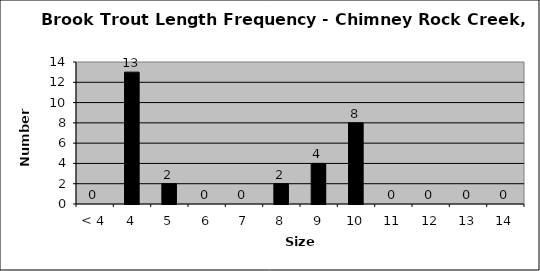
| Category | Series 0 |
|---|---|
| < 4 | 0 |
| 4 | 13 |
| 5 | 2 |
| 6 | 0 |
| 7 | 0 |
| 8 | 2 |
| 9 | 4 |
| 10 | 8 |
| 11 | 0 |
| 12 | 0 |
| 13 | 0 |
| 14 | 0 |